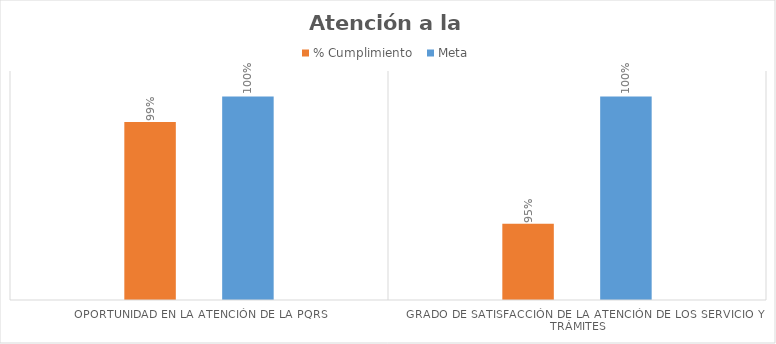
| Category | % Cumplimiento  | Meta |
|---|---|---|
| Oportunidad en la atención de la PQRS  | 0.99 | 1 |
| Grado de satisfacción de la atención de los servicio y trámites | 0.95 | 1 |